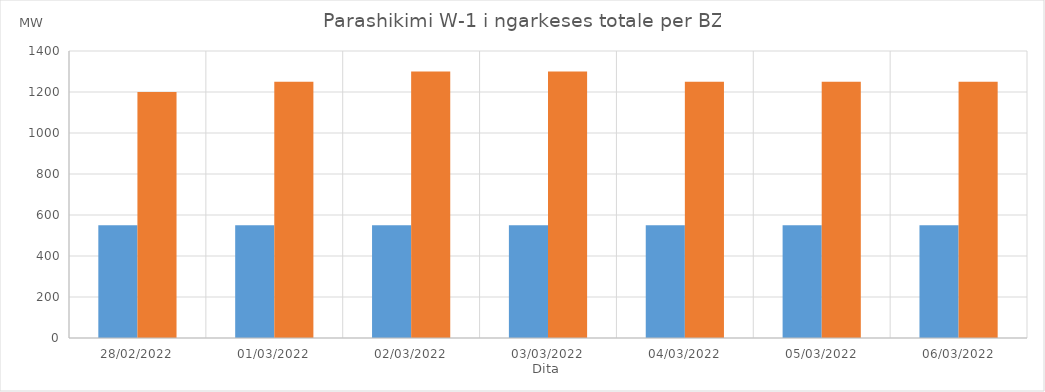
| Category | Min (MW) | Max (MW) |
|---|---|---|
| 28/02/2022 | 550 | 1200 |
| 01/03/2022 | 550 | 1250 |
| 02/03/2022 | 550 | 1300 |
| 03/03/2022 | 550 | 1300 |
| 04/03/2022 | 550 | 1250 |
| 05/03/2022 | 550 | 1250 |
| 06/03/2022 | 550 | 1250 |